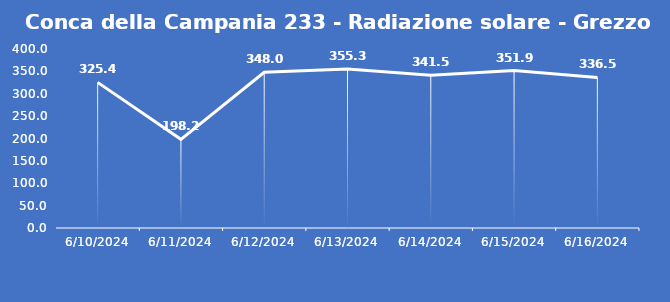
| Category | Conca della Campania 233 - Radiazione solare - Grezzo (W/m2) |
|---|---|
| 6/10/24 | 325.4 |
| 6/11/24 | 198.2 |
| 6/12/24 | 348 |
| 6/13/24 | 355.3 |
| 6/14/24 | 341.5 |
| 6/15/24 | 351.9 |
| 6/16/24 | 336.5 |